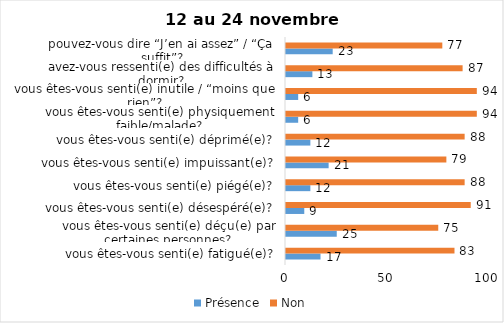
| Category | Présence | Non |
|---|---|---|
| vous êtes-vous senti(e) fatigué(e)? | 17 | 83 |
| vous êtes-vous senti(e) déçu(e) par certaines personnes? | 25 | 75 |
| vous êtes-vous senti(e) désespéré(e)? | 9 | 91 |
| vous êtes-vous senti(e) piégé(e)? | 12 | 88 |
| vous êtes-vous senti(e) impuissant(e)? | 21 | 79 |
| vous êtes-vous senti(e) déprimé(e)? | 12 | 88 |
| vous êtes-vous senti(e) physiquement faible/malade? | 6 | 94 |
| vous êtes-vous senti(e) inutile / “moins que rien”? | 6 | 94 |
| avez-vous ressenti(e) des difficultés à dormir? | 13 | 87 |
| pouvez-vous dire “J’en ai assez” / “Ça suffit”? | 23 | 77 |